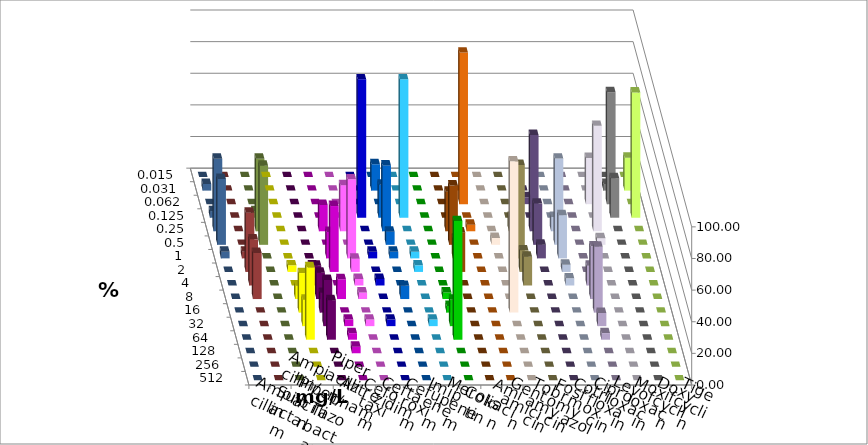
| Category | Ampicillin | Ampicillin/ Sulbactam | Piperacillin | Piperacillin/ Tazobactam | Aztreonam | Cefotaxim | Ceftazidim | Cefuroxim | Imipenem | Meropenem | Colistin | Amikacin | Gentamicin | Tobramycin | Fosfomycin | Cotrimoxazol | Ciprofloxacin | Levofloxacin | Moxifloxacin | Doxycyclin | Tigecyclin |
|---|---|---|---|---|---|---|---|---|---|---|---|---|---|---|---|---|---|---|---|---|---|
| 0.015 | 0 | 0 | 0 | 0 | 0 | 0 | 0 | 0 | 0 | 0 | 0 | 0 | 0 | 0 | 0 | 0 | 0 | 0 | 0 | 0 | 0 |
| 0.031 | 0 | 0 | 0 | 0 | 0 | 16.667 | 0 | 0 | 0 | 0 | 0 | 0 | 0 | 0 | 0 | 0 | 4.167 | 20.833 | 4.167 | 0 | 0 |
| 0.062 | 0 | 0 | 0 | 0 | 0 | 0 | 0 | 0 | 0 | 95.833 | 0 | 0 | 4.348 | 0 | 0 | 29.167 | 70.833 | 0 | 0 | 0 | 0 |
| 0.125 | 0 | 0 | 0 | 0 | 87.5 | 20.833 | 87.5 | 0 | 0 | 0 | 0 | 0 | 0 | 0 | 0 | 0 | 25 | 79.167 | 4.167 | 0 | 4.167 |
| 0.25 | 0 | 0 | 16.667 | 29.167 | 0 | 41.667 | 0 | 0 | 25 | 4.167 | 0 | 9.091 | 60.87 | 9.091 | 0 | 66.667 | 0 | 0 | 45.833 | 0 | 45.833 |
| 0.5 | 0 | 0 | 0 | 0 | 0 | 8.333 | 0 | 0 | 37.5 | 0 | 4.348 | 0 | 26.087 | 54.545 | 0 | 4.167 | 0 | 0 | 41.667 | 0 | 50 |
| 1.0 | 0 | 0 | 16.667 | 50 | 4.167 | 4.167 | 4.167 | 0 | 12.5 | 0 | 0 | 59.091 | 8.696 | 27.273 | 0 | 0 | 0 | 0 | 4.167 | 4.167 | 0 |
| 2.0 | 4.167 | 4.167 | 41.667 | 8.333 | 0 | 0 | 4.167 | 0 | 25 | 0 | 0 | 13.636 | 0 | 4.545 | 0 | 0 | 0 | 0 | 0 | 37.5 | 0 |
| 4.0 | 0 | 12.5 | 0 | 4.167 | 4.167 | 0 | 0 | 0 | 0 | 0 | 0 | 18.182 | 0 | 4.545 | 12.5 | 0 | 0 | 0 | 0 | 29.167 | 0 |
| 8.0 | 8.333 | 16.667 | 12.5 | 4.167 | 0 | 8.333 | 0 | 4.167 | 0 | 0 | 0 | 0 | 0 | 0 | 33.333 | 0 | 0 | 0 | 0 | 29.167 | 0 |
| 16.0 | 25 | 12.5 | 0 | 0 | 0 | 0 | 0 | 4.167 | 0 | 0 | 95.652 | 0 | 0 | 0 | 41.667 | 0 | 0 | 0 | 0 | 0 | 0 |
| 32.0 | 16.667 | 29.167 | 4.167 | 4.167 | 4.167 | 0 | 4.167 | 16.667 | 0 | 0 | 0 | 0 | 0 | 0 | 8.333 | 0 | 0 | 0 | 0 | 0 | 0 |
| 64.0 | 45.833 | 25 | 4.167 | 0 | 0 | 0 | 0 | 75 | 0 | 0 | 0 | 0 | 0 | 0 | 4.167 | 0 | 0 | 0 | 0 | 0 | 0 |
| 128.0 | 0 | 0 | 4.167 | 0 | 0 | 0 | 0 | 0 | 0 | 0 | 0 | 0 | 0 | 0 | 0 | 0 | 0 | 0 | 0 | 0 | 0 |
| 256.0 | 0 | 0 | 0 | 0 | 0 | 0 | 0 | 0 | 0 | 0 | 0 | 0 | 0 | 0 | 0 | 0 | 0 | 0 | 0 | 0 | 0 |
| 512.0 | 0 | 0 | 0 | 0 | 0 | 0 | 0 | 0 | 0 | 0 | 0 | 0 | 0 | 0 | 0 | 0 | 0 | 0 | 0 | 0 | 0 |